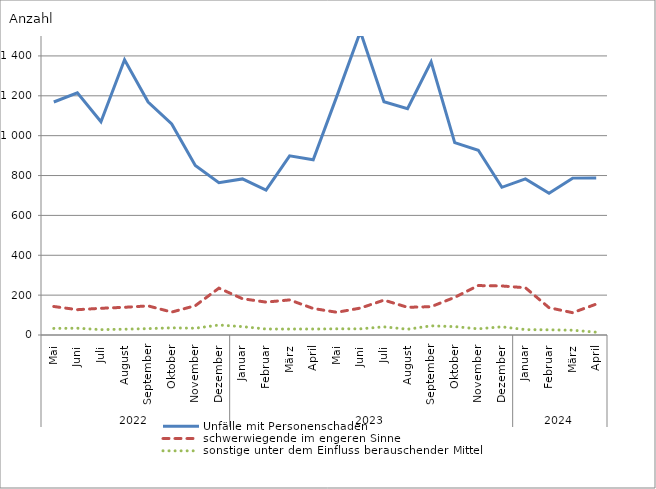
| Category | Unfälle mit Personenschaden | schwerwiegende im engeren Sinne | sonstige unter dem Einfluss berauschender Mittel |
|---|---|---|---|
| 0 | 1169 | 143 | 33 |
| 1 | 1215 | 127 | 34 |
| 2 | 1070 | 134 | 27 |
| 3 | 1381 | 139 | 29 |
| 4 | 1169 | 146 | 32 |
| 5 | 1059 | 115 | 36 |
| 6 | 850 | 147 | 34 |
| 7 | 764 | 235 | 50 |
| 8 | 783 | 182 | 42 |
| 9 | 727 | 165 | 30 |
| 10 | 899 | 176 | 30 |
| 11 | 879 | 133 | 30 |
| 12 | 1197 | 114 | 31 |
| 13 | 1522 | 135 | 31 |
| 14 | 1170 | 175 | 41 |
| 15 | 1135 | 139 | 29 |
| 16 | 1371 | 142 | 46 |
| 17 | 965 | 189 | 42 |
| 18 | 927 | 248 | 31 |
| 19 | 741 | 246 | 41 |
| 20 | 783 | 237 | 27 |
| 21 | 711 | 137 | 26 |
| 22 | 787 | 112 | 24 |
| 23 | 788 | 155 | 14 |